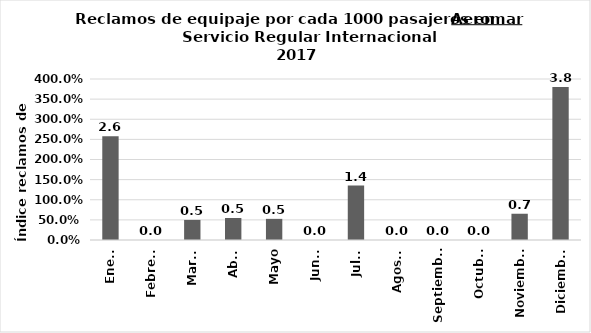
| Category | Reclamos por cada 1000 pasajeros |
|---|---|
| Enero | 2.577 |
| Febrero | 0 |
| Marzo | 0.499 |
| Abril | 0.547 |
| Mayo | 0.525 |
| Junio | 0 |
| Julio | 1.353 |
| Agosto | 0 |
| Septiembre | 0 |
| Octubre | 0 |
| Noviembre | 0.652 |
| Diciembre | 3.8 |